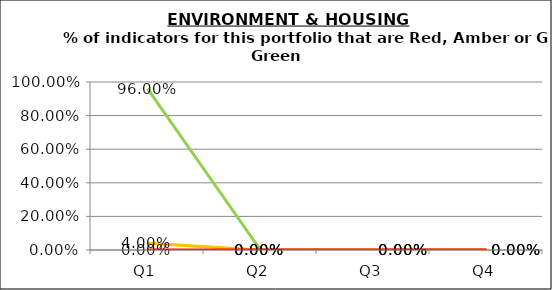
| Category | Green | Amber | Red |
|---|---|---|---|
| Q1 | 0.96 | 0.04 | 0 |
| Q2 | 0 | 0 | 0 |
| Q3 | 0 | 0 | 0 |
| Q4 | 0 | 0 | 0 |